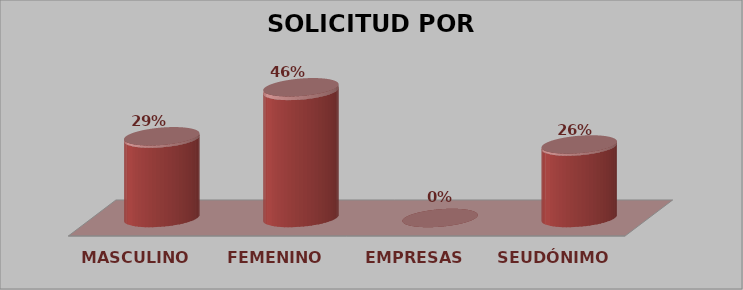
| Category | SOLICITUD POR GÉNERO | Series 1 |
|---|---|---|
| MASCULINO | 10 | 0.286 |
| FEMENINO | 16 | 0.457 |
| EMPRESAS | 0 | 0 |
| SEUDÓNIMO | 9 | 0.257 |